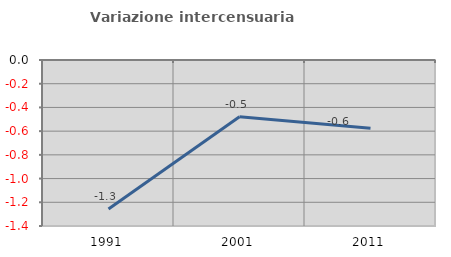
| Category | Variazione intercensuaria annua |
|---|---|
| 1991.0 | -1.257 |
| 2001.0 | -0.479 |
| 2011.0 | -0.575 |